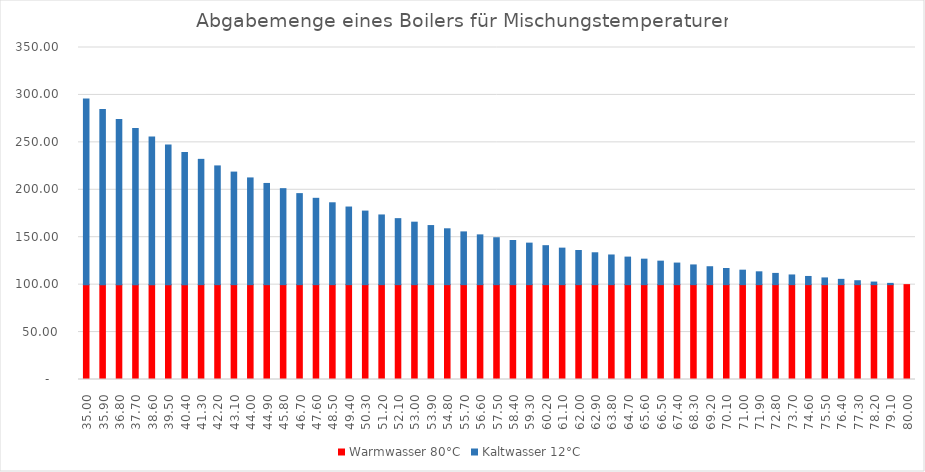
| Category | Warmwasser 80°C | Kaltwasser 12°C |
|---|---|---|
| 35.0 | 100 | 195.652 |
| 35.9 | 100 | 184.519 |
| 36.8 | 100 | 174.194 |
| 37.7 | 100 | 164.591 |
| 38.6 | 100 | 155.639 |
| 39.5 | 100 | 147.273 |
| 40.4 | 100 | 139.437 |
| 41.3 | 100 | 132.082 |
| 42.2 | 100 | 125.166 |
| 43.1 | 100 | 118.65 |
| 44.0 | 100 | 112.5 |
| 44.9 | 100 | 106.687 |
| 45.8 | 100 | 101.183 |
| 46.7 | 100 | 95.965 |
| 47.6 | 100 | 91.011 |
| 48.5 | 100 | 86.301 |
| 49.4 | 100 | 81.818 |
| 50.3 | 100 | 77.546 |
| 51.2 | 100 | 73.469 |
| 52.1 | 100 | 69.576 |
| 53.0 | 100 | 65.854 |
| 53.900000000000006 | 100 | 62.291 |
| 54.8 | 100 | 58.879 |
| 55.7 | 100 | 55.606 |
| 56.6 | 100 | 52.466 |
| 57.5 | 100 | 49.451 |
| 58.400000000000006 | 100 | 46.552 |
| 59.3 | 100 | 43.763 |
| 60.2 | 100 | 41.079 |
| 61.1 | 100 | 38.493 |
| 62.0 | 100 | 36 |
| 62.900000000000006 | 100 | 33.595 |
| 63.8 | 100 | 31.274 |
| 64.7 | 100 | 29.032 |
| 65.6 | 100 | 26.866 |
| 66.5 | 100 | 24.771 |
| 67.4 | 100 | 22.744 |
| 68.30000000000001 | 100 | 20.782 |
| 69.2 | 100 | 18.881 |
| 70.1 | 100 | 17.04 |
| 71.0 | 100 | 15.254 |
| 71.9 | 100 | 13.523 |
| 72.80000000000001 | 100 | 11.842 |
| 73.7 | 100 | 10.211 |
| 74.6 | 100 | 8.626 |
| 75.5 | 100 | 7.087 |
| 76.4 | 100 | 5.59 |
| 77.30000000000001 | 100 | 4.135 |
| 78.2 | 100 | 2.719 |
| 79.1 | 100 | 1.341 |
| 80.0 | 100 | 0 |